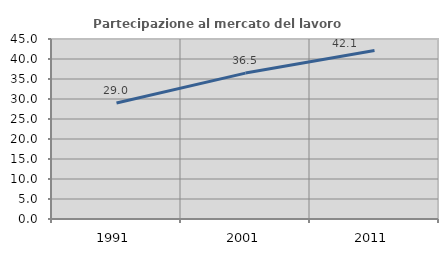
| Category | Partecipazione al mercato del lavoro  femminile |
|---|---|
| 1991.0 | 28.995 |
| 2001.0 | 36.478 |
| 2011.0 | 42.105 |